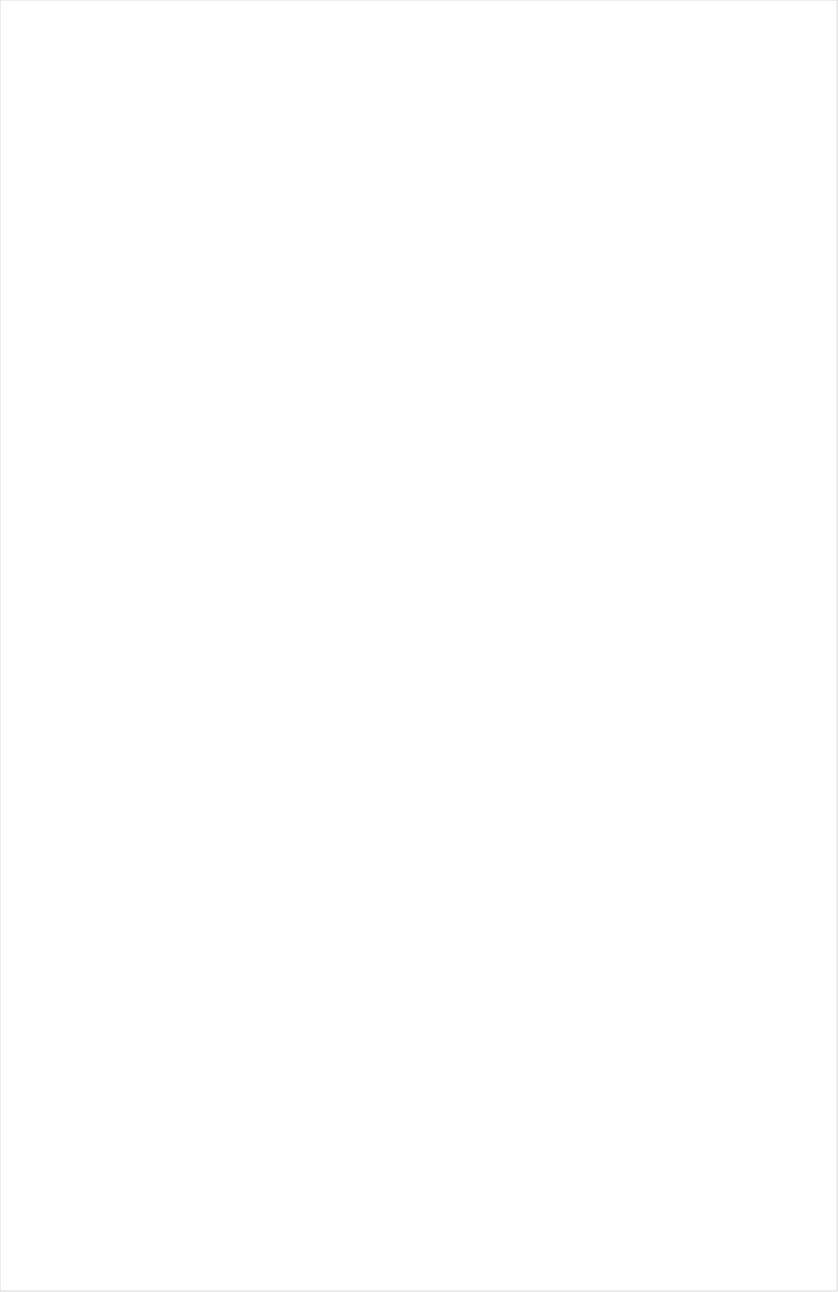
| Category | Total |
|---|---|
| TUDN | -0.218 |
| Nick Toons | -0.204 |
| Teen Nick | -0.2 |
| ESPN Deportes | -0.2 |
| VH1 | -0.198 |
| Nick Jr. | -0.197 |
| Disney Channel | -0.196 |
| Cartoon Network | -0.192 |
| Nick | -0.19 |
| Disney Junior US | -0.186 |
| Galavision | -0.182 |
| Univision | -0.168 |
| MTV2 | -0.165 |
| UniMas | -0.162 |
| NBC Universo | -0.16 |
| MTV | -0.157 |
| Telemundo | -0.154 |
| Disney XD | -0.154 |
| Nick@Nite | -0.154 |
| truTV | -0.146 |
| Universal Kids | -0.142 |
| Adult Swim | -0.141 |
| BET | -0.118 |
| Comedy Central | -0.115 |
| TV ONE | -0.108 |
| FXX | -0.106 |
| ESPN | -0.102 |
| FX | -0.1 |
| E! | -0.09 |
| Freeform | -0.088 |
| Viceland | -0.087 |
| NBA TV | -0.087 |
| Logo | -0.084 |
| ESPN2 | -0.083 |
| BET Her | -0.075 |
| ESPNEWS | -0.074 |
| FXDEP | -0.064 |
| TBS | -0.062 |
| Paramount Network | -0.062 |
| ESPNU | -0.061 |
| BRAVO | -0.058 |
| TNT | -0.055 |
| NFL Network | -0.051 |
| NHL | -0.045 |
| AMC | -0.04 |
| Lifetime | -0.039 |
| Lifetime Movies | -0.039 |
| FX Movie Channel | -0.038 |
| A&E | -0.035 |
| NBC Sports | -0.035 |
| Independent Film (IFC) | -0.034 |
| USA Network | -0.033 |
| Discovery Family Channel | -0.033 |
| SYFY | -0.033 |
| CMTV | -0.024 |
| WE TV | -0.014 |
| Food Network | -0.011 |
| TLC | -0.01 |
| BBC America | -0.008 |
| Cooking Channel | -0.008 |
| PAC-12 Network | -0.008 |
| Fox Sports 1 | -0.006 |
| Discovery Channel | -0.002 |
| CNBC | -0.002 |
| Travel | -0.001 |
| MyNetworkTV | 0 |
| Investigation Discovery | 0.007 |
| OXYGEN | 0.009 |
| FOX | 0.01 |
| Big Ten Network | 0.015 |
| POP | 0.016 |
| Oprah Winfrey Network | 0.017 |
| MLB Network | 0.021 |
| Destination America | 0.025 |
| CW | 0.026 |
| Reelz Channel | 0.027 |
| The Sportsman Channel | 0.029 |
| National Geographic | 0.032 |
| Discovery Life Channel | 0.032 |
| SundanceTV | 0.033 |
| Animal Planet | 0.035 |
| Motor Trend Network | 0.035 |
| CNN | 0.05 |
| FYI | 0.05 |
| ABC | 0.053 |
| Headline News | 0.057 |
| Game Show | 0.059 |
| ION | 0.059 |
| Ovation | 0.063 |
| NBC | 0.063 |
| DIY | 0.064 |
| HGTV | 0.064 |
| History Channel | 0.067 |
| TV LAND | 0.071 |
| UP TV | 0.071 |
| Great American Country | 0.077 |
| WGN America | 0.081 |
| Bloomberg HD | 0.089 |
| American Heroes Channel | 0.09 |
| Science Channel | 0.094 |
| Olympic Channel | 0.101 |
| Golf | 0.101 |
| Outdoor Channel | 0.103 |
| CBS | 0.114 |
| National Geographic Wild | 0.118 |
| Weather Channel | 0.12 |
| Tennis Channel | 0.136 |
| Fox News | 0.137 |
| CBS Sports | 0.142 |
| Hallmark | 0.158 |
| Smithsonian | 0.171 |
| Fox Business | 0.184 |
| MSNBC | 0.185 |
| PBS | 0.25 |
| Hallmark Movies & Mysteries | 0.258 |
| INSP | 0.267 |
| RFD TV | 0.297 |